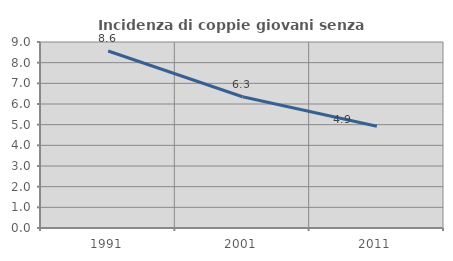
| Category | Incidenza di coppie giovani senza figli |
|---|---|
| 1991.0 | 8.563 |
| 2001.0 | 6.35 |
| 2011.0 | 4.925 |